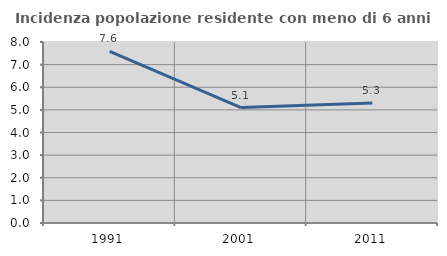
| Category | Incidenza popolazione residente con meno di 6 anni |
|---|---|
| 1991.0 | 7.589 |
| 2001.0 | 5.103 |
| 2011.0 | 5.305 |